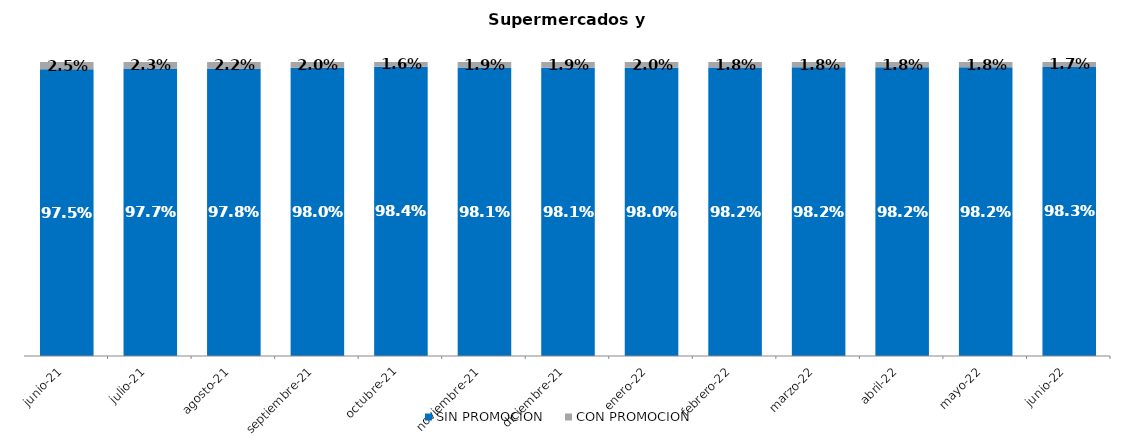
| Category | SIN PROMOCION   | CON PROMOCION   |
|---|---|---|
| 2021-06-01 | 0.975 | 0.025 |
| 2021-07-01 | 0.977 | 0.023 |
| 2021-08-01 | 0.978 | 0.022 |
| 2021-09-01 | 0.98 | 0.02 |
| 2021-10-01 | 0.984 | 0.016 |
| 2021-11-01 | 0.981 | 0.019 |
| 2021-12-01 | 0.981 | 0.019 |
| 2022-01-01 | 0.98 | 0.02 |
| 2022-02-01 | 0.982 | 0.018 |
| 2022-03-01 | 0.982 | 0.018 |
| 2022-04-01 | 0.982 | 0.018 |
| 2022-05-01 | 0.982 | 0.018 |
| 2022-06-01 | 0.983 | 0.017 |